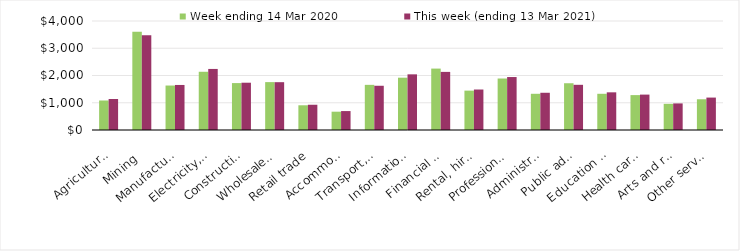
| Category | Week ending 14 Mar 2020 | This week (ending 13 Mar 2021) |
|---|---|---|
| Agriculture, forestry and fishing | 1082.79 | 1137.36 |
| Mining | 3607.59 | 3481.45 |
| Manufacturing | 1631.98 | 1652.82 |
| Electricity, gas, water and waste services | 2136.84 | 2240.6 |
| Construction | 1721.77 | 1735.22 |
| Wholesale trade | 1757.46 | 1754.94 |
| Retail trade | 907.3 | 926.72 |
| Accommodation and food services | 672.17 | 694.76 |
| Transport, postal and warehousing | 1656.71 | 1623.33 |
| Information media and telecommunications | 1919.56 | 2042.51 |
| Financial and insurance services | 2253.65 | 2132.43 |
| Rental, hiring and real estate services | 1444.93 | 1485.6 |
| Professional, scientific and technical services | 1889.42 | 1943.62 |
| Administrative and support services | 1328.8 | 1366.28 |
| Public administration and safety | 1716.04 | 1658.21 |
| Education and training | 1329.01 | 1382.49 |
| Health care and social assistance | 1280.67 | 1298.97 |
| Arts and recreation services | 960.68 | 975.82 |
| Other services | 1128.07 | 1189.78 |